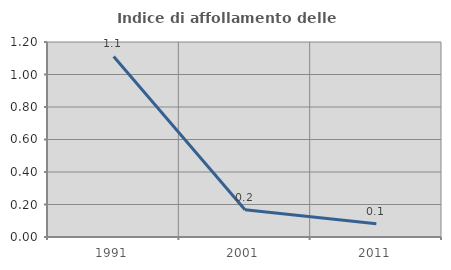
| Category | Indice di affollamento delle abitazioni  |
|---|---|
| 1991.0 | 1.111 |
| 2001.0 | 0.167 |
| 2011.0 | 0.081 |